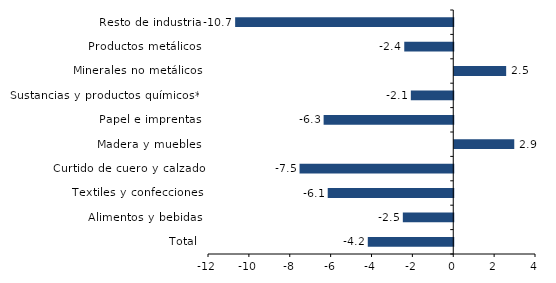
| Category | Series 0 |
|---|---|
| Total | -4.181 |
| Alimentos y bebidas | -2.467 |
| Textiles y confecciones | -6.142 |
| Curtido de cuero y calzado | -7.521 |
| Madera y muebles | 2.936 |
| Papel e imprentas | -6.343 |
| Sustancias y productos químicos** | -2.075 |
| Minerales no metálicos | 2.54 |
| Productos metálicos | -2.397 |
| Resto de industria | -10.672 |